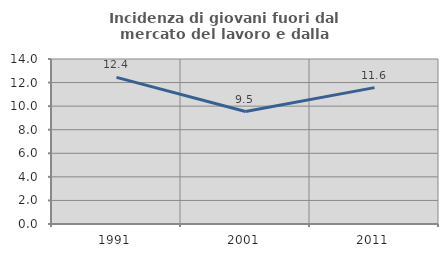
| Category | Incidenza di giovani fuori dal mercato del lavoro e dalla formazione  |
|---|---|
| 1991.0 | 12.439 |
| 2001.0 | 9.539 |
| 2011.0 | 11.57 |